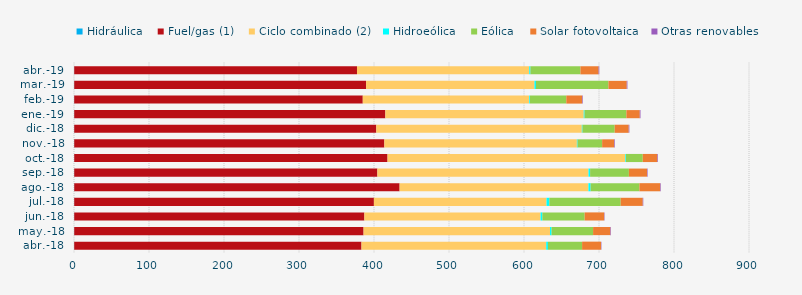
| Category | Hidráulica | Fuel/gas (1) | Ciclo combinado (2) | Hidroeólica | Eólica | Solar fotovoltaica | Otras renovables |
|---|---|---|---|---|---|---|---|
| abr.-18 | 0.276 | 383.044 | 246.338 | 2.263 | 45.546 | 25.221 | 0.539 |
| may.-18 | 0.308 | 385.794 | 248.617 | 2.034 | 55.352 | 23.093 | 0.751 |
| jun.-18 | 0.294 | 386.885 | 234.948 | 2.322 | 56.43 | 26.004 | 0.531 |
| jul.-18 | 0.296 | 399.578 | 230.146 | 3.716 | 95.158 | 29.446 | 0.702 |
| ago.-18 | 0.308 | 433.842 | 251.789 | 2.859 | 65.081 | 27.696 | 0.816 |
| sep.-18 | 0.288 | 404.236 | 281.475 | 2.166 | 51.688 | 24.128 | 0.783 |
| oct.-18 | 0.297 | 417.763 | 317.069 | 0.873 | 22.352 | 19.5 | 0.813 |
| nov.-18 | 0.289 | 413.521 | 256.697 | 0.901 | 32.777 | 16.121 | 0.85 |
| dic.-18 | 0.296 | 402.8 | 273.986 | 0.91 | 42.932 | 18.676 | 0.899 |
| ene.-19 | 0.293 | 414.861 | 264.507 | 1.11 | 55.717 | 17.87 | 0.963 |
| feb.-19 | 0.265 | 384.771 | 221.965 | 0.973 | 48.408 | 21.221 | 0.823 |
| mar.-19 | 0.298 | 389.166 | 224.523 | 1.955 | 96.623 | 24.424 | 0.901 |
| abr.-19 | 0.294 | 377.029 | 229.694 | 1.548 | 66.674 | 24.226 | 0.896 |